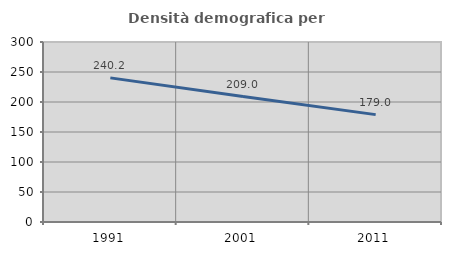
| Category | Densità demografica |
|---|---|
| 1991.0 | 240.212 |
| 2001.0 | 209 |
| 2011.0 | 178.974 |